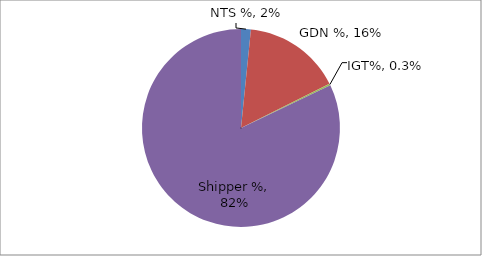
| Category | Series 0 |
|---|---|
| NTS % | 0.016 |
| GDN % | 0.16 |
| IGT% | 0.003 |
| Shipper % | 0.821 |